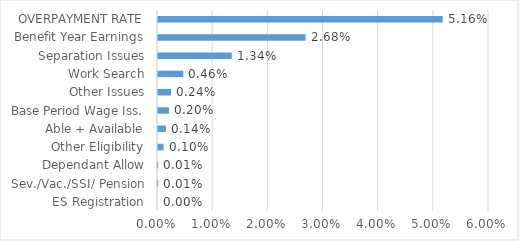
| Category | Series 0 |
|---|---|
| ES Registration | 0 |
| Sev./Vac./SSI/ Pension | 0 |
| Dependant Allow | 0 |
| Other Eligibility | 0.001 |
| Able + Available | 0.001 |
| Base Period Wage Iss. | 0.002 |
| Other Issues | 0.002 |
| Work Search | 0.005 |
| Separation Issues | 0.013 |
| Benefit Year Earnings | 0.027 |
| OVERPAYMENT RATE | 0.052 |